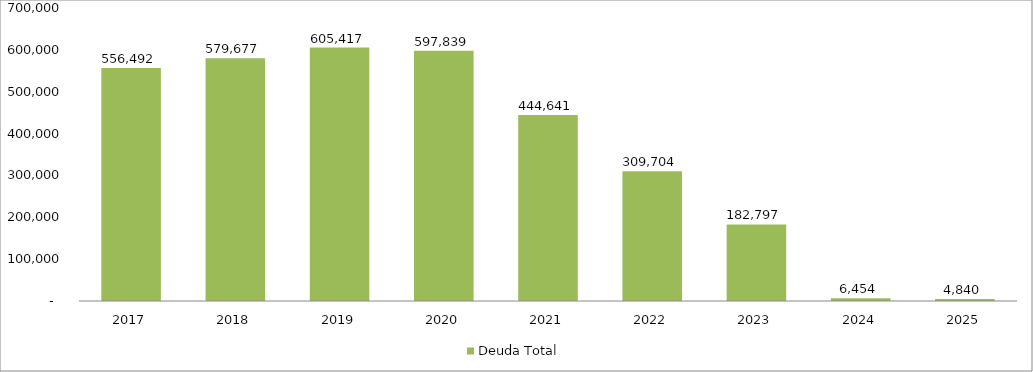
| Category | Deuda Total |
|---|---|
| 2017 | 556491.646 |
| 2018 | 579676.665 |
| 2019 | 605416.616 |
| 2020 | 597839.04 |
| 2021 | 444640.844 |
| 2022 | 309703.926 |
| 2023 | 182796.693 |
| 2024 | 6453.836 |
| 2025 | 4840.377 |